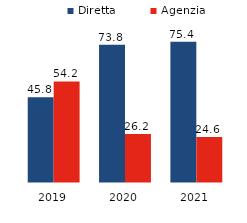
| Category | Diretta | Agenzia |
|---|---|---|
| 2019.0 | 45.8 | 54.2 |
| 2020.0 | 73.8 | 26.2 |
| 2021.0 | 75.4 | 24.6 |